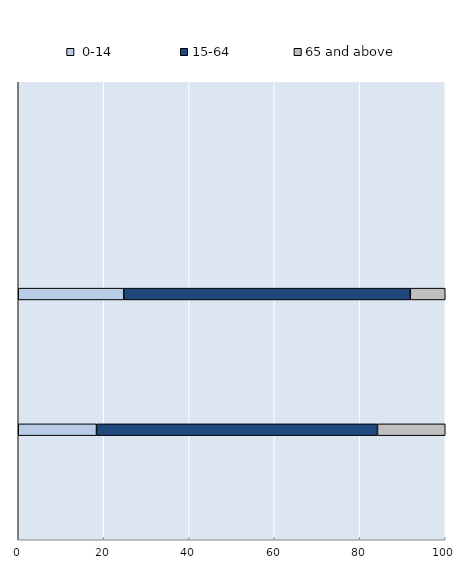
| Category |  0-14  | 15-64 | 65 and above |
|---|---|---|---|
| 0 | 0 | 0 | 0 |
| 1 | 0 | 0 | 0 |
| 2 | 0 | 0 | 0 |
| 3 | 0 | 0 | 0 |
| 4 | 0 | 0 | 0 |
| 5 | 0 | 0 | 0 |
| 6 | 0 | 0 | 0 |
| 7 | 0 | 0 | 0 |
| 8 | 0 | 0 | 0 |
| 9 | 0 | 0 | 0 |
| 10 | 0 | 0 | 0 |
| 11 | 0 | 0 | 0 |
| 12 | 24.701 | 67.113 | 8.186 |
| 13 | 0 | 0 | 0 |
| 14 | 0 | 0 | 0 |
| 15 | 0 | 0 | 0 |
| 16 | 0 | 0 | 0 |
| 17 | 0 | 0 | 0 |
| 18 | 0 | 0 | 0 |
| 19 | 0 | 0 | 0 |
| 20 | 18.325 | 65.803 | 15.873 |
| 21 | 0 | 0 | 0 |
| 22 | 0 | 0 | 0 |
| 23 | 0 | 0 | 0 |
| 24 | 0 | 0 | 0 |
| 25 | 0 | 0 | 0 |
| 26 | 0 | 0 | 0 |